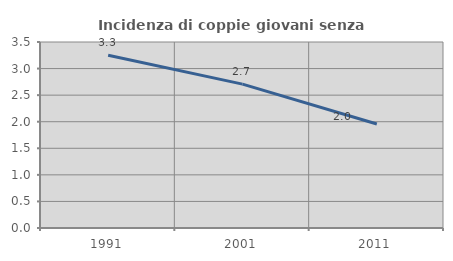
| Category | Incidenza di coppie giovani senza figli |
|---|---|
| 1991.0 | 3.252 |
| 2001.0 | 2.707 |
| 2011.0 | 1.958 |